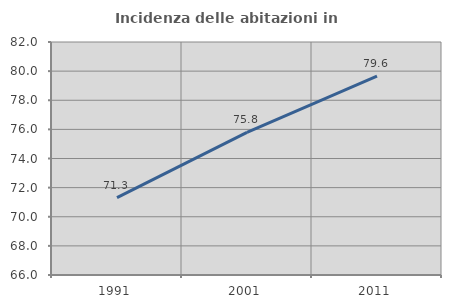
| Category | Incidenza delle abitazioni in proprietà  |
|---|---|
| 1991.0 | 71.308 |
| 2001.0 | 75.792 |
| 2011.0 | 79.648 |